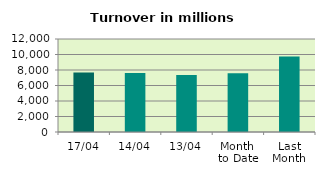
| Category | Series 0 |
|---|---|
| 17/04 | 7691.011 |
| 14/04 | 7603.642 |
| 13/04 | 7366.602 |
| Month 
to Date | 7581.961 |
| Last
Month | 9734.736 |